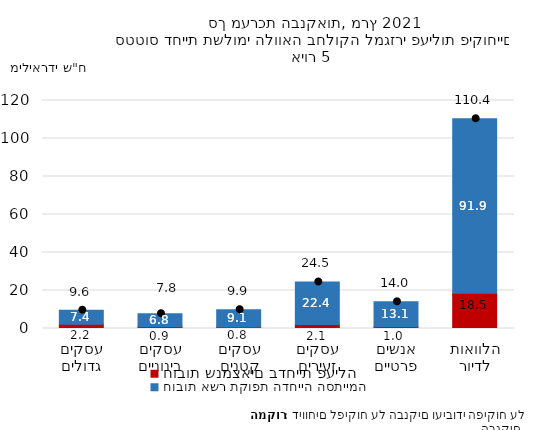
| Category | חובות שנמצאים בדחיית פעילה | חובות אשר תקופת הדחייה הסתיימה |
|---|---|---|
| עסקים גדולים | 2.21 | 7.419 |
| עסקים בינוניים | 0.939 | 6.833 |
| עסקים קטנים | 0.809 | 9.119 |
| עסקים זעירים | 2.087 | 22.392 |
| אנשים פרטיים | 0.958 | 13.073 |
| הלוואות לדיור | 18.501 | 91.879 |